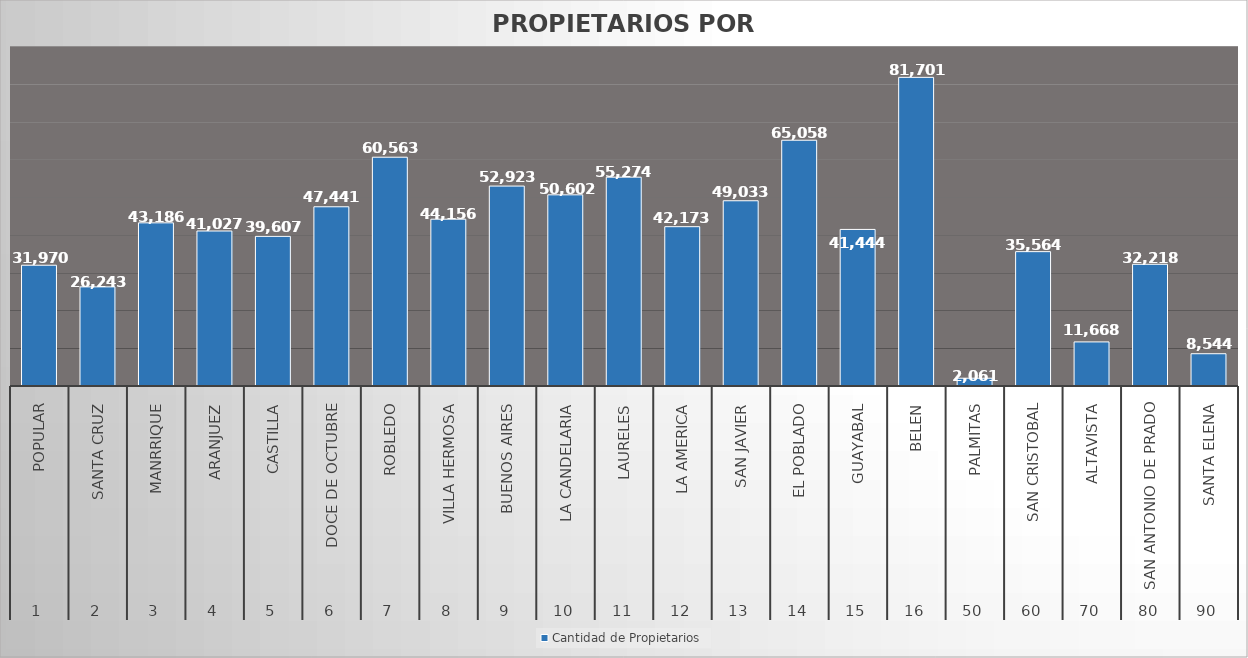
| Category | Cantidad de Propietarios |
|---|---|
| 0 | 31970 |
| 1 | 26243 |
| 2 | 43186 |
| 3 | 41027 |
| 4 | 39607 |
| 5 | 47441 |
| 6 | 60563 |
| 7 | 44156 |
| 8 | 52923 |
| 9 | 50602 |
| 10 | 55274 |
| 11 | 42173 |
| 12 | 49033 |
| 13 | 65058 |
| 14 | 41444 |
| 15 | 81701 |
| 16 | 2061 |
| 17 | 35564 |
| 18 | 11668 |
| 19 | 32218 |
| 20 | 8544 |